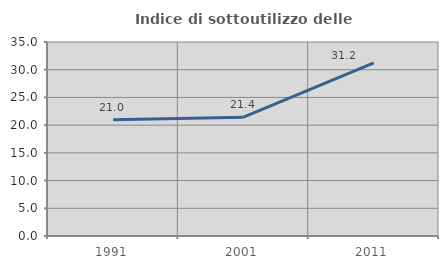
| Category | Indice di sottoutilizzo delle abitazioni  |
|---|---|
| 1991.0 | 20.968 |
| 2001.0 | 21.429 |
| 2011.0 | 31.214 |